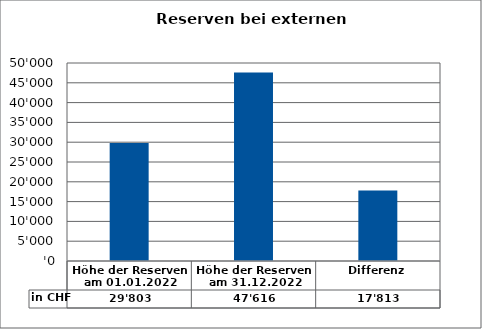
| Category | in CHF |
|---|---|
| Höhe der Reserven am 01.01.2022 | 29802.8 |
| Höhe der Reserven am 31.12.2022 | 47616.1 |
| Differenz | 17813.3 |